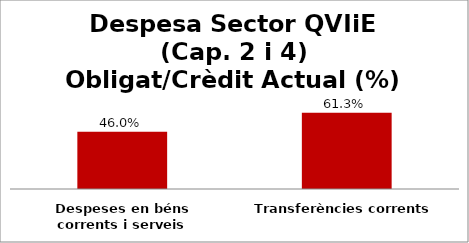
| Category | Series 0 |
|---|---|
| Despeses en béns corrents i serveis | 0.46 |
| Transferències corrents | 0.613 |